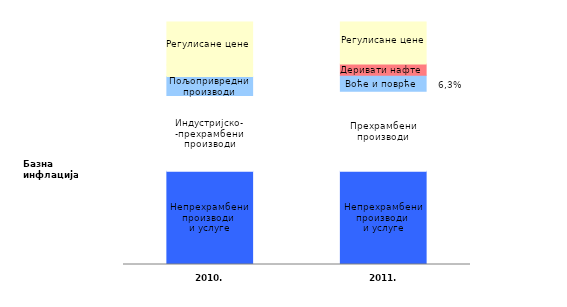
| Category | Непрехрамбени производи 
и услуге | Индустријско-
-прехрамбени производи | Пољопривредни производи | Деривати нафте | Регулисане цене |
|---|---|---|---|---|---|
| 2010. | 3669 | 2983 | 752 | 448 | 1700 |
| 2011. | 3669 | 3152 | 625 | 448 | 1658 |